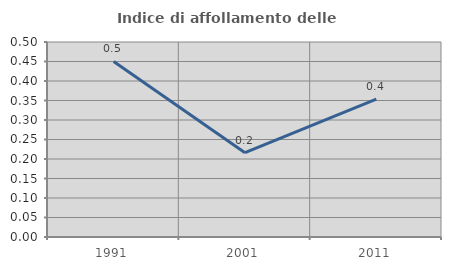
| Category | Indice di affollamento delle abitazioni  |
|---|---|
| 1991.0 | 0.45 |
| 2001.0 | 0.216 |
| 2011.0 | 0.354 |